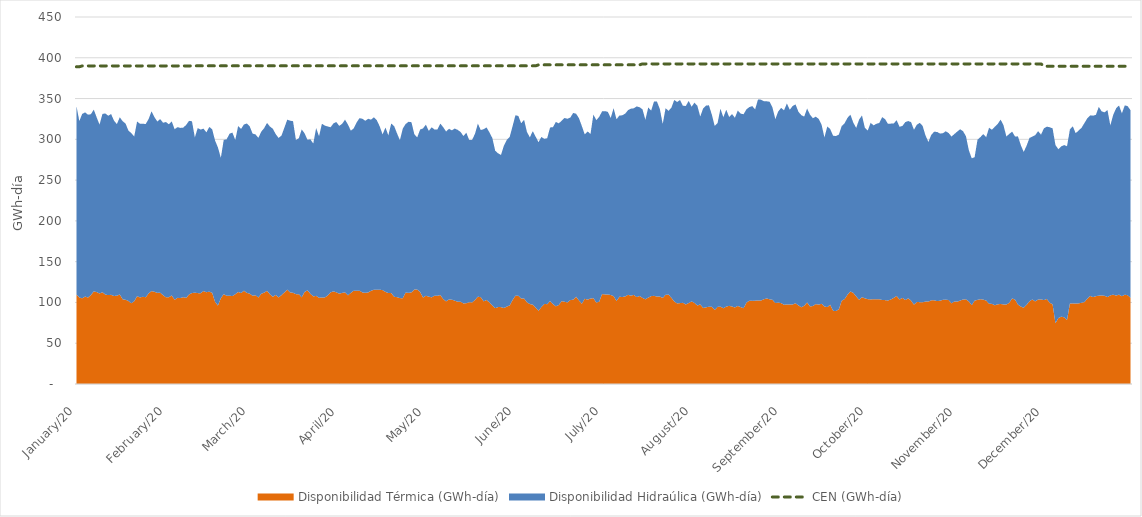
| Category | CEN (GWh-día) |
|---|---|
| 2020-01-01 | 388.968 |
| 2020-01-02 | 388.968 |
| 2020-01-03 | 390.024 |
| 2020-01-04 | 390.024 |
| 2020-01-05 | 390.024 |
| 2020-01-06 | 390.024 |
| 2020-01-07 | 390.024 |
| 2020-01-08 | 390.024 |
| 2020-01-09 | 390.024 |
| 2020-01-10 | 390.024 |
| 2020-01-11 | 390.024 |
| 2020-01-12 | 390.024 |
| 2020-01-13 | 390.024 |
| 2020-01-14 | 390.024 |
| 2020-01-15 | 390.024 |
| 2020-01-16 | 390.024 |
| 2020-01-17 | 390.024 |
| 2020-01-18 | 390.024 |
| 2020-01-19 | 390.024 |
| 2020-01-20 | 390.024 |
| 2020-01-21 | 390.024 |
| 2020-01-22 | 390.024 |
| 2020-01-23 | 390.024 |
| 2020-01-24 | 390.024 |
| 2020-01-25 | 390.024 |
| 2020-01-26 | 390.024 |
| 2020-01-27 | 390.024 |
| 2020-01-28 | 390.024 |
| 2020-01-29 | 390.024 |
| 2020-01-30 | 390.024 |
| 2020-01-31 | 390.024 |
| 2020-02-01 | 390.024 |
| 2020-02-02 | 390.024 |
| 2020-02-03 | 390.024 |
| 2020-02-04 | 390.024 |
| 2020-02-05 | 390.024 |
| 2020-02-06 | 390.024 |
| 2020-02-07 | 390.024 |
| 2020-02-08 | 390.024 |
| 2020-02-09 | 390.024 |
| 2020-02-10 | 390.024 |
| 2020-02-11 | 390.12 |
| 2020-02-12 | 390.12 |
| 2020-02-13 | 390.12 |
| 2020-02-14 | 390.12 |
| 2020-02-15 | 390.12 |
| 2020-02-16 | 390.12 |
| 2020-02-17 | 390.12 |
| 2020-02-18 | 390.12 |
| 2020-02-19 | 390.12 |
| 2020-02-20 | 390.12 |
| 2020-02-21 | 390.12 |
| 2020-02-22 | 390.12 |
| 2020-02-23 | 390.12 |
| 2020-02-24 | 390.12 |
| 2020-02-25 | 390.12 |
| 2020-02-26 | 390.12 |
| 2020-02-27 | 390.12 |
| 2020-02-28 | 390.12 |
| 2020-02-29 | 390.12 |
| 2020-03-01 | 390.12 |
| 2020-03-02 | 390.12 |
| 2020-03-03 | 390.12 |
| 2020-03-04 | 390.12 |
| 2020-03-05 | 390.12 |
| 2020-03-06 | 390.12 |
| 2020-03-07 | 390.12 |
| 2020-03-08 | 390.12 |
| 2020-03-09 | 390.12 |
| 2020-03-10 | 390.12 |
| 2020-03-11 | 390.12 |
| 2020-03-12 | 390.12 |
| 2020-03-13 | 390.12 |
| 2020-03-14 | 390.12 |
| 2020-03-15 | 390.12 |
| 2020-03-16 | 390.12 |
| 2020-03-17 | 390.12 |
| 2020-03-18 | 390.12 |
| 2020-03-19 | 390.12 |
| 2020-03-20 | 390.12 |
| 2020-03-21 | 390.12 |
| 2020-03-22 | 390.12 |
| 2020-03-23 | 390.12 |
| 2020-03-24 | 390.12 |
| 2020-03-25 | 390.12 |
| 2020-03-26 | 390.12 |
| 2020-03-27 | 390.12 |
| 2020-03-28 | 390.12 |
| 2020-03-29 | 390.12 |
| 2020-03-30 | 390.12 |
| 2020-03-31 | 390.12 |
| 2020-04-01 | 390.12 |
| 2020-04-02 | 390.12 |
| 2020-04-03 | 390.12 |
| 2020-04-04 | 390.12 |
| 2020-04-05 | 390.12 |
| 2020-04-06 | 390.12 |
| 2020-04-07 | 390.12 |
| 2020-04-08 | 390.12 |
| 2020-04-09 | 390.12 |
| 2020-04-10 | 390.12 |
| 2020-04-11 | 390.12 |
| 2020-04-12 | 390.12 |
| 2020-04-13 | 390.12 |
| 2020-04-14 | 390.12 |
| 2020-04-15 | 390.12 |
| 2020-04-16 | 390.12 |
| 2020-04-17 | 390.12 |
| 2020-04-18 | 390.12 |
| 2020-04-19 | 390.12 |
| 2020-04-20 | 390.12 |
| 2020-04-21 | 390.12 |
| 2020-04-22 | 390.12 |
| 2020-04-23 | 390.12 |
| 2020-04-24 | 390.12 |
| 2020-04-25 | 390.12 |
| 2020-04-26 | 390.12 |
| 2020-04-27 | 390.12 |
| 2020-04-28 | 390.12 |
| 2020-04-29 | 390.12 |
| 2020-04-30 | 390.12 |
| 2020-05-01 | 390.12 |
| 2020-05-02 | 390.12 |
| 2020-05-03 | 390.12 |
| 2020-05-04 | 390.12 |
| 2020-05-05 | 390.12 |
| 2020-05-06 | 390.12 |
| 2020-05-07 | 390.12 |
| 2020-05-08 | 390.12 |
| 2020-05-09 | 390.12 |
| 2020-05-10 | 390.12 |
| 2020-05-11 | 390.12 |
| 2020-05-12 | 390.12 |
| 2020-05-13 | 390.12 |
| 2020-05-14 | 390.12 |
| 2020-05-15 | 390.12 |
| 2020-05-16 | 390.12 |
| 2020-05-17 | 390.12 |
| 2020-05-18 | 390.12 |
| 2020-05-19 | 390.12 |
| 2020-05-20 | 390.12 |
| 2020-05-21 | 390.12 |
| 2020-05-22 | 390.12 |
| 2020-05-23 | 390.12 |
| 2020-05-24 | 390.12 |
| 2020-05-25 | 390.12 |
| 2020-05-26 | 390.12 |
| 2020-05-27 | 390.12 |
| 2020-05-28 | 390.12 |
| 2020-05-29 | 390.12 |
| 2020-05-30 | 390.12 |
| 2020-05-31 | 390.12 |
| 2020-06-01 | 390.12 |
| 2020-06-02 | 390.12 |
| 2020-06-03 | 390.12 |
| 2020-06-04 | 390.12 |
| 2020-06-05 | 390.12 |
| 2020-06-06 | 390.12 |
| 2020-06-07 | 390.12 |
| 2020-06-08 | 390.12 |
| 2020-06-09 | 391.32 |
| 2020-06-10 | 391.32 |
| 2020-06-11 | 391.32 |
| 2020-06-12 | 391.32 |
| 2020-06-13 | 391.32 |
| 2020-06-14 | 391.32 |
| 2020-06-15 | 391.32 |
| 2020-06-16 | 391.32 |
| 2020-06-17 | 391.32 |
| 2020-06-18 | 391.32 |
| 2020-06-19 | 391.32 |
| 2020-06-20 | 391.32 |
| 2020-06-21 | 391.32 |
| 2020-06-22 | 391.32 |
| 2020-06-23 | 391.32 |
| 2020-06-24 | 391.32 |
| 2020-06-25 | 391.32 |
| 2020-06-26 | 391.32 |
| 2020-06-27 | 391.32 |
| 2020-06-28 | 391.32 |
| 2020-06-29 | 391.32 |
| 2020-06-30 | 391.32 |
| 2020-07-01 | 391.32 |
| 2020-07-02 | 391.32 |
| 2020-07-03 | 391.32 |
| 2020-07-04 | 391.32 |
| 2020-07-05 | 391.32 |
| 2020-07-06 | 391.32 |
| 2020-07-07 | 391.32 |
| 2020-07-08 | 391.32 |
| 2020-07-09 | 391.32 |
| 2020-07-10 | 391.32 |
| 2020-07-11 | 391.32 |
| 2020-07-12 | 391.32 |
| 2020-07-13 | 391.32 |
| 2020-07-14 | 391.32 |
| 2020-07-15 | 392.52 |
| 2020-07-16 | 392.52 |
| 2020-07-17 | 392.52 |
| 2020-07-18 | 392.52 |
| 2020-07-19 | 392.52 |
| 2020-07-20 | 392.52 |
| 2020-07-21 | 392.52 |
| 2020-07-22 | 392.52 |
| 2020-07-23 | 392.52 |
| 2020-07-24 | 392.52 |
| 2020-07-25 | 392.52 |
| 2020-07-26 | 392.52 |
| 2020-07-27 | 392.52 |
| 2020-07-28 | 392.52 |
| 2020-07-29 | 392.52 |
| 2020-07-30 | 392.52 |
| 2020-07-31 | 392.52 |
| 2020-08-01 | 392.52 |
| 2020-08-02 | 392.52 |
| 2020-08-03 | 392.52 |
| 2020-08-04 | 392.52 |
| 2020-08-05 | 392.52 |
| 2020-08-06 | 392.52 |
| 2020-08-07 | 392.52 |
| 2020-08-08 | 392.52 |
| 2020-08-09 | 392.52 |
| 2020-08-10 | 392.52 |
| 2020-08-11 | 392.52 |
| 2020-08-12 | 392.52 |
| 2020-08-13 | 392.52 |
| 2020-08-14 | 392.52 |
| 2020-08-15 | 392.52 |
| 2020-08-16 | 392.52 |
| 2020-08-17 | 392.52 |
| 2020-08-18 | 392.52 |
| 2020-08-19 | 392.52 |
| 2020-08-20 | 392.52 |
| 2020-08-21 | 392.52 |
| 2020-08-22 | 392.52 |
| 2020-08-23 | 392.52 |
| 2020-08-24 | 392.52 |
| 2020-08-25 | 392.52 |
| 2020-08-26 | 392.52 |
| 2020-08-27 | 392.52 |
| 2020-08-28 | 392.52 |
| 2020-08-29 | 392.52 |
| 2020-08-30 | 392.52 |
| 2020-08-31 | 392.52 |
| 2020-09-01 | 392.52 |
| 2020-09-02 | 392.52 |
| 2020-09-03 | 392.52 |
| 2020-09-04 | 392.52 |
| 2020-09-05 | 392.52 |
| 2020-09-06 | 392.52 |
| 2020-09-07 | 392.52 |
| 2020-09-08 | 392.52 |
| 2020-09-09 | 392.52 |
| 2020-09-10 | 392.52 |
| 2020-09-11 | 392.52 |
| 2020-09-12 | 392.52 |
| 2020-09-13 | 392.52 |
| 2020-09-14 | 392.52 |
| 2020-09-15 | 392.52 |
| 2020-09-16 | 392.52 |
| 2020-09-17 | 392.52 |
| 2020-09-18 | 392.52 |
| 2020-09-19 | 392.52 |
| 2020-09-20 | 392.52 |
| 2020-09-21 | 392.52 |
| 2020-09-22 | 392.52 |
| 2020-09-23 | 392.52 |
| 2020-09-24 | 392.52 |
| 2020-09-25 | 392.52 |
| 2020-09-26 | 392.52 |
| 2020-09-27 | 392.52 |
| 2020-09-28 | 392.52 |
| 2020-09-29 | 392.52 |
| 2020-09-30 | 392.52 |
| 2020-10-01 | 392.52 |
| 2020-10-02 | 392.52 |
| 2020-10-03 | 392.52 |
| 2020-10-04 | 392.52 |
| 2020-10-05 | 392.52 |
| 2020-10-06 | 392.52 |
| 2020-10-07 | 392.52 |
| 2020-10-08 | 392.52 |
| 2020-10-09 | 392.52 |
| 2020-10-10 | 392.52 |
| 2020-10-11 | 392.52 |
| 2020-10-12 | 392.52 |
| 2020-10-13 | 392.52 |
| 2020-10-14 | 392.52 |
| 2020-10-15 | 392.52 |
| 2020-10-16 | 392.52 |
| 2020-10-17 | 392.52 |
| 2020-10-18 | 392.52 |
| 2020-10-19 | 392.52 |
| 2020-10-20 | 392.52 |
| 2020-10-21 | 392.52 |
| 2020-10-22 | 392.52 |
| 2020-10-23 | 392.52 |
| 2020-10-24 | 392.52 |
| 2020-10-25 | 392.52 |
| 2020-10-26 | 392.52 |
| 2020-10-27 | 392.52 |
| 2020-10-28 | 392.52 |
| 2020-10-29 | 392.52 |
| 2020-10-30 | 392.52 |
| 2020-10-31 | 392.52 |
| 2020-11-01 | 392.52 |
| 2020-11-02 | 392.52 |
| 2020-11-03 | 392.52 |
| 2020-11-04 | 392.52 |
| 2020-11-05 | 392.52 |
| 2020-11-06 | 392.52 |
| 2020-11-07 | 392.52 |
| 2020-11-08 | 392.52 |
| 2020-11-09 | 392.52 |
| 2020-11-10 | 392.52 |
| 2020-11-11 | 392.52 |
| 2020-11-12 | 392.52 |
| 2020-11-13 | 392.52 |
| 2020-11-14 | 392.52 |
| 2020-11-15 | 392.52 |
| 2020-11-16 | 392.52 |
| 2020-11-17 | 392.52 |
| 2020-11-18 | 392.52 |
| 2020-11-19 | 392.52 |
| 2020-11-20 | 392.52 |
| 2020-11-21 | 392.52 |
| 2020-11-22 | 392.52 |
| 2020-11-23 | 392.52 |
| 2020-11-24 | 392.52 |
| 2020-11-25 | 392.52 |
| 2020-11-26 | 392.52 |
| 2020-11-27 | 392.52 |
| 2020-11-28 | 392.52 |
| 2020-11-29 | 392.52 |
| 2020-11-30 | 392.52 |
| 2020-12-01 | 389.568 |
| 2020-12-02 | 389.568 |
| 2020-12-03 | 389.568 |
| 2020-12-04 | 389.568 |
| 2020-12-05 | 389.568 |
| 2020-12-06 | 389.568 |
| 2020-12-07 | 389.568 |
| 2020-12-08 | 389.568 |
| 2020-12-09 | 389.568 |
| 2020-12-10 | 389.568 |
| 2020-12-11 | 389.568 |
| 2020-12-12 | 389.568 |
| 2020-12-13 | 389.568 |
| 2020-12-14 | 389.568 |
| 2020-12-15 | 389.568 |
| 2020-12-16 | 389.568 |
| 2020-12-17 | 389.568 |
| 2020-12-18 | 389.568 |
| 2020-12-19 | 389.568 |
| 2020-12-20 | 389.568 |
| 2020-12-21 | 389.568 |
| 2020-12-22 | 389.568 |
| 2020-12-23 | 389.568 |
| 2020-12-24 | 389.568 |
| 2020-12-25 | 389.568 |
| 2020-12-26 | 389.568 |
| 2020-12-27 | 389.568 |
| 2020-12-28 | 389.568 |
| 2020-12-29 | 389.568 |
| 2020-12-30 | 389.568 |
| 2020-12-31 | 389.568 |